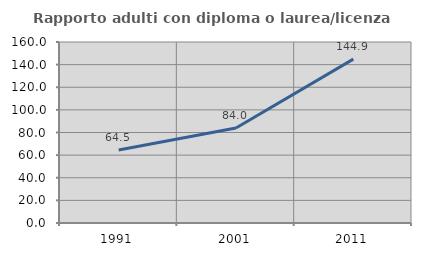
| Category | Rapporto adulti con diploma o laurea/licenza media  |
|---|---|
| 1991.0 | 64.474 |
| 2001.0 | 84 |
| 2011.0 | 144.898 |